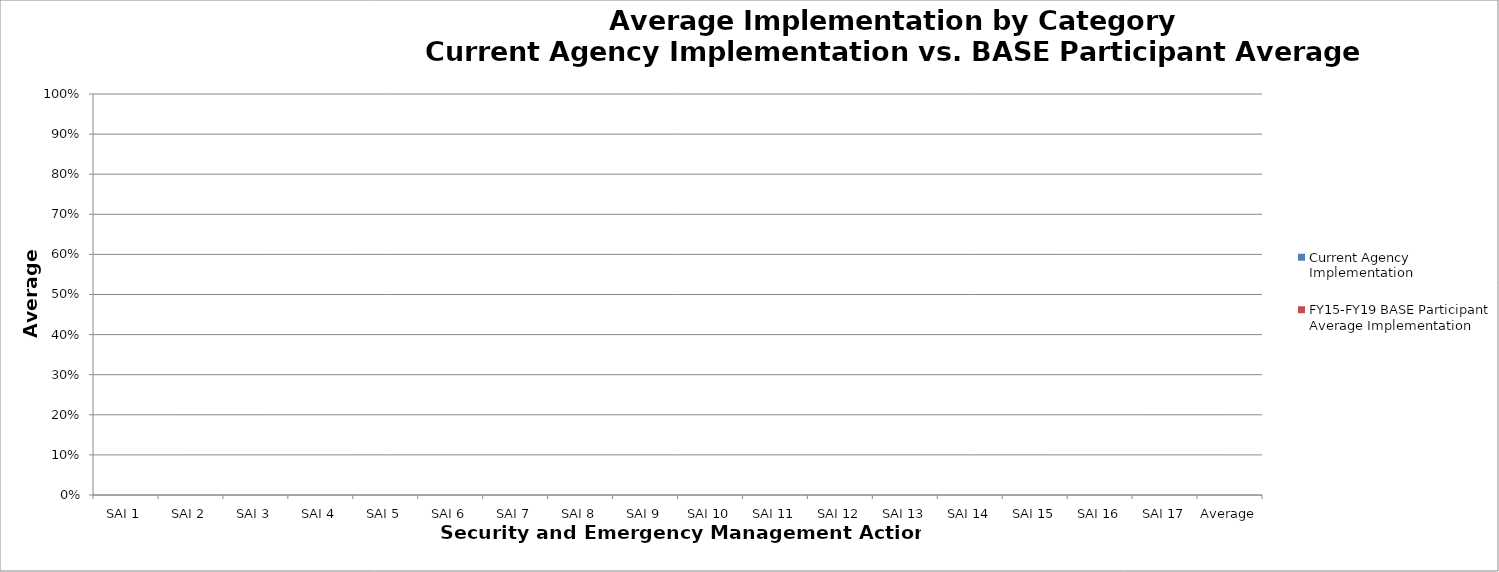
| Category | Current Agency Implementation | FY15-FY19 BASE Participant Average Implementation |
|---|---|---|
| SAI 1 | 0 | 0 |
| SAI 2 | 0 | 0 |
| SAI 3 | 0 | 0 |
| SAI 4 | 0 | 0 |
| SAI 5 | 0 | 0 |
| SAI 6 | 0 | 0 |
| SAI 7 | 0 | 0 |
| SAI 8 | 0 | 0 |
| SAI 9 | 0 | 0 |
| SAI 10 | 0 | 0 |
| SAI 11 | 0 | 0 |
| SAI 12 | 0 | 0 |
| SAI 13 | 0 | 0 |
| SAI 14 | 0 | 0 |
| SAI 15 | 0 | 0 |
| SAI 16 | 0 | 0 |
| SAI 17 | 0 | 0 |
| Average | 0 | 0 |